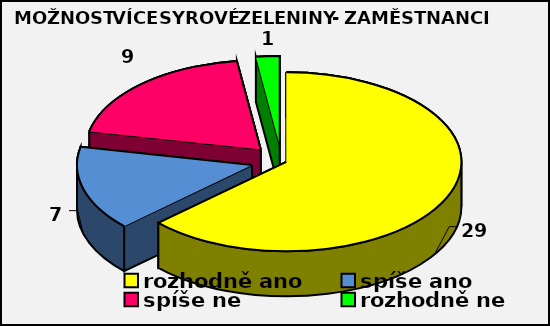
| Category | Series 0 |
|---|---|
| rozhodně ano | 29 |
| spíše ano | 7 |
| spíše ne  | 9 |
| rozhodně ne  | 1 |